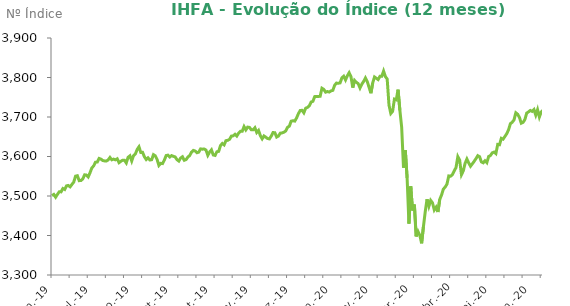
| Category | Series 0 |
|---|---|
| 2019-06-03 | 3501.03 |
| 2019-06-04 | 3503.99 |
| 2019-06-05 | 3496.92 |
| 2019-06-06 | 3504.11 |
| 2019-06-07 | 3510.63 |
| 2019-06-10 | 3510.43 |
| 2019-06-11 | 3518.93 |
| 2019-06-12 | 3516.54 |
| 2019-06-13 | 3525.65 |
| 2019-06-14 | 3526.71 |
| 2019-06-17 | 3523.26 |
| 2019-06-18 | 3529.37 |
| 2019-06-19 | 3535.22 |
| 2019-06-21 | 3550.18 |
| 2019-06-24 | 3551.32 |
| 2019-06-25 | 3538.83 |
| 2019-06-26 | 3539.32 |
| 2019-06-27 | 3543.3 |
| 2019-06-28 | 3553.65 |
| 2019-07-01 | 3553.04 |
| 2019-07-02 | 3548.42 |
| 2019-07-03 | 3558.97 |
| 2019-07-04 | 3571.32 |
| 2019-07-05 | 3576.12 |
| 2019-07-08 | 3585.51 |
| 2019-07-09 | 3586.05 |
| 2019-07-10 | 3595.15 |
| 2019-07-11 | 3593.46 |
| 2019-07-12 | 3589.89 |
| 2019-07-15 | 3588.83 |
| 2019-07-16 | 3588.57 |
| 2019-07-17 | 3591.38 |
| 2019-07-18 | 3597.59 |
| 2019-07-19 | 3591.67 |
| 2019-07-22 | 3593.35 |
| 2019-07-23 | 3591.51 |
| 2019-07-24 | 3594.15 |
| 2019-07-25 | 3584.45 |
| 2019-07-26 | 3587.89 |
| 2019-07-29 | 3590.73 |
| 2019-07-30 | 3590.33 |
| 2019-07-31 | 3583.69 |
| 2019-08-01 | 3598.05 |
| 2019-08-02 | 3601.69 |
| 2019-08-05 | 3588.68 |
| 2019-08-06 | 3602.24 |
| 2019-08-07 | 3606.34 |
| 2019-08-08 | 3617.72 |
| 2019-08-09 | 3624.53 |
| 2019-08-12 | 3610.34 |
| 2019-08-13 | 3610.55 |
| 2019-08-14 | 3599.38 |
| 2019-08-15 | 3592.43 |
| 2019-08-16 | 3596.68 |
| 2019-08-19 | 3591.12 |
| 2019-08-20 | 3591.86 |
| 2019-08-21 | 3604.7 |
| 2019-08-22 | 3601.78 |
| 2019-08-23 | 3592.65 |
| 2019-08-26 | 3577.37 |
| 2019-08-27 | 3582.55 |
| 2019-08-28 | 3582.03 |
| 2019-08-29 | 3590.8 |
| 2019-08-30 | 3602.48 |
| 2019-09-02 | 3603.44 |
| 2019-09-03 | 3598.71 |
| 2019-09-04 | 3602.27 |
| 2019-09-05 | 3600.4 |
| 2019-09-06 | 3598.84 |
| 2019-09-09 | 3591.95 |
| 2019-09-10 | 3588.45 |
| 2019-09-11 | 3596.16 |
| 2019-09-12 | 3599.3 |
| 2019-09-13 | 3590.4 |
| 2019-09-16 | 3592.25 |
| 2019-09-17 | 3598.49 |
| 2019-09-18 | 3602.45 |
| 2019-09-19 | 3611.08 |
| 2019-09-20 | 3615.5 |
| 2019-09-23 | 3613.9 |
| 2019-09-24 | 3609.54 |
| 2019-09-25 | 3611.04 |
| 2019-09-26 | 3619.26 |
| 2019-09-27 | 3618.54 |
| 2019-09-30 | 3618.96 |
| 2019-10-01 | 3616.23 |
| 2019-10-02 | 3603.03 |
| 2019-10-03 | 3611.38 |
| 2019-10-04 | 3616.82 |
| 2019-10-07 | 3603.91 |
| 2019-10-08 | 3602.73 |
| 2019-10-09 | 3612.01 |
| 2019-10-10 | 3613.11 |
| 2019-10-11 | 3627.63 |
| 2019-10-14 | 3633.03 |
| 2019-10-15 | 3629.38 |
| 2019-10-16 | 3640.11 |
| 2019-10-17 | 3640.99 |
| 2019-10-18 | 3643.51 |
| 2019-10-21 | 3651.6 |
| 2019-10-22 | 3652.29 |
| 2019-10-23 | 3656.21 |
| 2019-10-24 | 3651.83 |
| 2019-10-25 | 3659.19 |
| 2019-10-28 | 3663.71 |
| 2019-10-29 | 3663.96 |
| 2019-10-30 | 3675.68 |
| 2019-10-31 | 3667.34 |
| 2019-11-01 | 3674.35 |
| 2019-11-04 | 3673.68 |
| 2019-11-05 | 3667.65 |
| 2019-11-06 | 3667.55 |
| 2019-11-07 | 3672.79 |
| 2019-11-08 | 3660.78 |
| 2019-11-11 | 3665.99 |
| 2019-11-12 | 3652.71 |
| 2019-11-13 | 3644.75 |
| 2019-11-14 | 3652.05 |
| 2019-11-18 | 3648.86 |
| 2019-11-19 | 3645.43 |
| 2019-11-20 | 3644.63 |
| 2019-11-21 | 3651.61 |
| 2019-11-22 | 3660.67 |
| 2019-11-25 | 3660.18 |
| 2019-11-26 | 3649.27 |
| 2019-11-27 | 3651.84 |
| 2019-11-28 | 3658.99 |
| 2019-11-29 | 3659.76 |
| 2019-12-02 | 3661.46 |
| 2019-12-03 | 3664.72 |
| 2019-12-04 | 3673.86 |
| 2019-12-05 | 3676.85 |
| 2019-12-06 | 3689.44 |
| 2019-12-09 | 3690.6 |
| 2019-12-10 | 3689.62 |
| 2019-12-11 | 3697.7 |
| 2019-12-12 | 3708.46 |
| 2019-12-13 | 3716.44 |
| 2019-12-16 | 3716.93 |
| 2019-12-17 | 3710.61 |
| 2019-12-18 | 3722.08 |
| 2019-12-19 | 3724.28 |
| 2019-12-20 | 3728.21 |
| 2019-12-23 | 3737.85 |
| 2019-12-24 | 3739.65 |
| 2019-12-26 | 3751.62 |
| 2019-12-27 | 3751.81 |
| 2019-12-30 | 3751.93 |
| 2019-12-31 | 3752.54 |
| 2020-01-02 | 3772.81 |
| 2020-01-03 | 3769.9 |
| 2020-01-06 | 3762.86 |
| 2020-01-07 | 3764.55 |
| 2020-01-08 | 3763.17 |
| 2020-01-09 | 3766.14 |
| 2020-01-10 | 3767.44 |
| 2020-01-13 | 3780.38 |
| 2020-01-14 | 3785.89 |
| 2020-01-15 | 3785.45 |
| 2020-01-16 | 3786.31 |
| 2020-01-17 | 3799.03 |
| 2020-01-20 | 3803.26 |
| 2020-01-21 | 3793.75 |
| 2020-01-22 | 3804.19 |
| 2020-01-23 | 3812.05 |
| 2020-01-24 | 3802.67 |
| 2020-01-27 | 3774.41 |
| 2020-01-28 | 3792.54 |
| 2020-01-29 | 3787.85 |
| 2020-01-30 | 3784.48 |
| 2020-01-31 | 3773.49 |
| 2020-02-03 | 3783.16 |
| 2020-02-04 | 3789.99 |
| 2020-02-05 | 3798.85 |
| 2020-02-06 | 3789.54 |
| 2020-02-07 | 3775.27 |
| 2020-02-10 | 3760.15 |
| 2020-02-11 | 3786.03 |
| 2020-02-12 | 3801.34 |
| 2020-02-13 | 3798.07 |
| 2020-02-14 | 3794.75 |
| 2020-02-17 | 3802.89 |
| 2020-02-18 | 3802.88 |
| 2020-02-19 | 3816.08 |
| 2020-02-20 | 3802.31 |
| 2020-02-21 | 3796.11 |
| 2020-02-26 | 3730.01 |
| 2020-02-27 | 3708.93 |
| 2020-02-28 | 3714.42 |
| 2020-03-02 | 3745.36 |
| 2020-03-03 | 3743.47 |
| 2020-03-04 | 3769.15 |
| 2020-03-05 | 3717.08 |
| 2020-03-06 | 3673.81 |
| 2020-03-09 | 3571.77 |
| 2020-03-10 | 3616.39 |
| 2020-03-11 | 3545.79 |
| 2020-03-12 | 3430.04 |
| 2020-03-13 | 3524.29 |
| 2020-03-16 | 3463.36 |
| 2020-03-17 | 3478.44 |
| 2020-03-18 | 3397.62 |
| 2020-03-19 | 3410.26 |
| 2020-03-20 | 3400.6 |
| 2020-03-23 | 3380.23 |
| 2020-03-24 | 3422.13 |
| 2020-03-25 | 3460.08 |
| 2020-03-26 | 3491.76 |
| 2020-03-27 | 3473.82 |
| 2020-03-30 | 3488.84 |
| 2020-03-31 | 3482.69 |
| 2020-04-01 | 3464.66 |
| 2020-04-02 | 3471.63 |
| 2020-04-03 | 3459.45 |
| 2020-04-06 | 3491.37 |
| 2020-04-07 | 3502.44 |
| 2020-04-08 | 3517.42 |
| 2020-04-09 | 3522.58 |
| 2020-04-13 | 3530.2 |
| 2020-04-14 | 3550.84 |
| 2020-04-15 | 3550.16 |
| 2020-04-16 | 3554.02 |
| 2020-04-17 | 3563.62 |
| 2020-04-20 | 3572.06 |
| 2020-04-22 | 3599.5 |
| 2020-04-23 | 3590.7 |
| 2020-04-24 | 3553.96 |
| 2020-04-27 | 3563.46 |
| 2020-04-28 | 3582.75 |
| 2020-04-29 | 3593.61 |
| 2020-04-30 | 3583.65 |
| 2020-05-04 | 3575.37 |
| 2020-05-05 | 3581.44 |
| 2020-05-06 | 3587.63 |
| 2020-05-07 | 3594.54 |
| 2020-05-08 | 3602.11 |
| 2020-05-11 | 3599.47 |
| 2020-05-12 | 3586.3 |
| 2020-05-13 | 3584 |
| 2020-05-14 | 3589.31 |
| 2020-05-15 | 3584.44 |
| 2020-05-18 | 3599.99 |
| 2020-05-19 | 3602.49 |
| 2020-05-20 | 3609.25 |
| 2020-05-21 | 3611.21 |
| 2020-05-22 | 3607.41 |
| 2020-05-25 | 3630.63 |
| 2020-05-26 | 3629.82 |
| 2020-05-27 | 3646.06 |
| 2020-05-28 | 3643.92 |
| 2020-05-29 | 3650.81 |
| 2020-06-01 | 3657.86 |
| 2020-06-02 | 3667.86 |
| 2020-06-03 | 3683.17 |
| 2020-06-04 | 3686.68 |
| 2020-06-05 | 3692.61 |
| 2020-06-08 | 3710.65 |
| 2020-06-09 | 3707.06 |
| 2020-06-10 | 3698.77 |
| 2020-06-12 | 3684.29 |
| 2020-06-15 | 3686.41 |
| 2020-06-16 | 3693.57 |
| 2020-06-17 | 3709.78 |
| 2020-06-18 | 3712.96 |
| 2020-06-19 | 3716.59 |
| 2020-06-22 | 3714.3 |
| 2020-06-23 | 3718.92 |
| 2020-06-24 | 3704.84 |
| 2020-06-25 | 3718.72 |
| 2020-06-26 | 3700.07 |
| 2020-06-29 | 3712.85 |
| 2020-06-30 | 3716.91 |